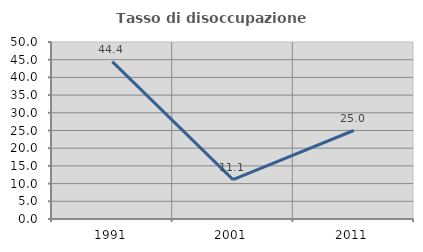
| Category | Tasso di disoccupazione giovanile  |
|---|---|
| 1991.0 | 44.444 |
| 2001.0 | 11.111 |
| 2011.0 | 25 |